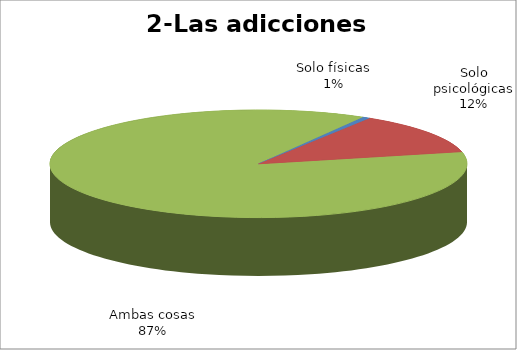
| Category | Series 0 |
|---|---|
| Solo físicas | 2 |
| Solo psicológicas | 41 |
| Ambas cosas | 287 |